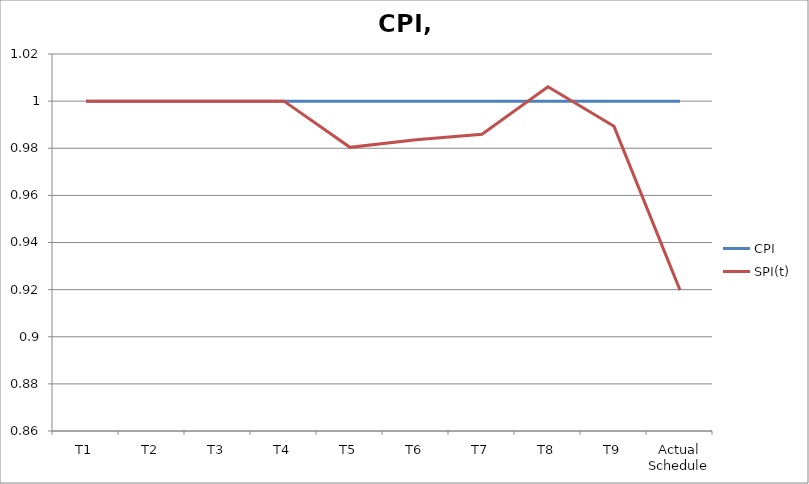
| Category | CPI | SPI(t) |
|---|---|---|
| T1 | 1 | 1 |
| T2 | 1 | 1 |
| T3 | 1 | 1 |
| T4 | 1 | 1 |
| T5 | 1 | 0.98 |
| T6 | 1 | 0.984 |
| T7 | 1 | 0.986 |
| T8 | 1 | 1.006 |
| T9 | 1 | 0.989 |
| Actual Schedule | 1 | 0.92 |